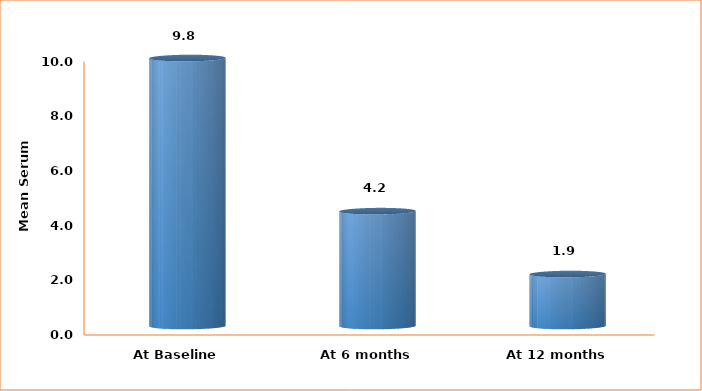
| Category | Series 0 |
|---|---|
| At Baseline | 9.8 |
| At 6 months | 4.2 |
| At 12 months | 1.9 |